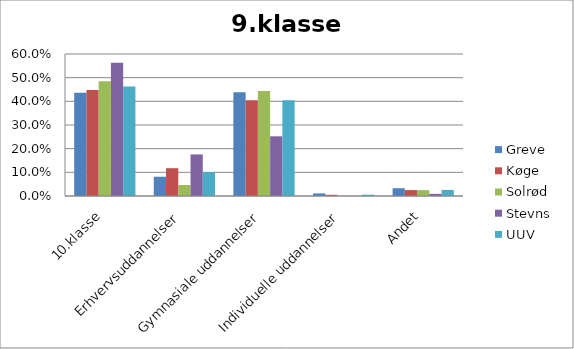
| Category | Greve | Køge | Solrød | Stevns | UUV |
|---|---|---|---|---|---|
| 10.klasse | 0.437 | 0.448 | 0.484 | 0.563 | 0.463 |
| Erhvervsuddannelser | 0.081 | 0.118 | 0.047 | 0.176 | 0.101 |
| Gymnasiale uddannelser | 0.438 | 0.405 | 0.444 | 0.252 | 0.405 |
| Individuelle uddannelser | 0.011 | 0.005 | 0 | 0 | 0.006 |
| Andet | 0.033 | 0.025 | 0.025 | 0.009 | 0.026 |